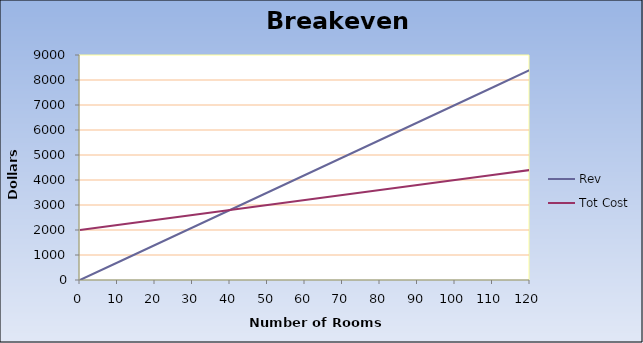
| Category | Rev | Tot Cost |
|---|---|---|
| 0.0 | 0 | 2000 |
| 10.0 | 700 | 2200 |
| 20.0 | 1400 | 2400 |
| 30.0 | 2100 | 2600 |
| 40.0 | 2800 | 2800 |
| 50.0 | 3500 | 3000 |
| 60.0 | 4200 | 3200 |
| 70.0 | 4900 | 3400 |
| 80.0 | 5600 | 3600 |
| 90.0 | 6300 | 3800 |
| 100.0 | 7000 | 4000 |
| 110.0 | 7700 | 4200 |
| 120.0 | 8400 | 4400 |